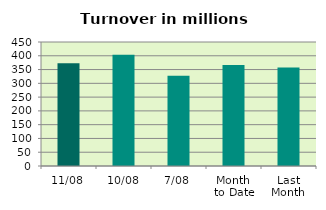
| Category | Series 0 |
|---|---|
| 11/08 | 373.162 |
| 10/08 | 403.907 |
| 7/08 | 327.334 |
| Month 
to Date | 366.231 |
| Last
Month | 357.784 |